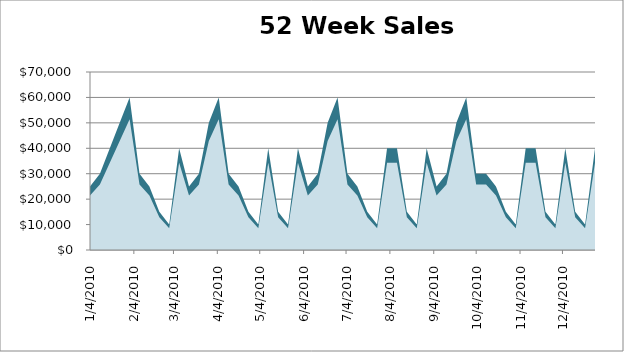
| Category | Widget 1 | Widget 2 | Widget 3 | Widget 4 | Widget 5 | Widget 6 | Widget 7 | Widget 8 | Widget 9 |
|---|---|---|---|---|---|---|---|---|---|
| 1/4/10 | 25000 | 20000 | 14000 | 7000 | 7700 | 13090 | 15353.333 | 18398.333 | 21443.333 |
| 1/11/10 | 30000 | 24000 | 16800 | 8400 | 9240 | 15708 | 18424 | 22078 | 25732 |
| 1/18/10 | 40000 | 32000 | 22400 | 11200 | 12320 | 20944 | 24565.333 | 29437.333 | 34309.333 |
| 1/25/10 | 50000 | 40000 | 28000 | 14000 | 15400 | 26180 | 30706.667 | 36796.667 | 42886.667 |
| 2/1/10 | 60000 | 48000 | 33600 | 16800 | 18480 | 31416 | 36848 | 44156 | 51464 |
| 2/8/10 | 30000 | 24000 | 16800 | 8400 | 9240 | 15708 | 18424 | 22078 | 25732 |
| 2/15/10 | 25000 | 20000 | 14000 | 7000 | 7700 | 13090 | 15353.333 | 18398.333 | 21443.333 |
| 2/22/10 | 15000 | 12000 | 8400 | 4200 | 4620 | 7854 | 9212 | 11039 | 12866 |
| 3/1/10 | 10000 | 8000 | 5600 | 2800 | 3080 | 5236 | 6141.333 | 7359.333 | 8577.333 |
| 3/8/10 | 40000 | 32000 | 22400 | 11200 | 12320 | 20944 | 24565.333 | 29437.333 | 34309.333 |
| 3/15/10 | 25000 | 20000 | 14000 | 7000 | 7700 | 13090 | 15353.333 | 18398.333 | 21443.333 |
| 3/22/10 | 30000 | 24000 | 16800 | 8400 | 9240 | 15708 | 18424 | 22078 | 25732 |
| 3/29/10 | 50000 | 40000 | 28000 | 14000 | 15400 | 26180 | 30706.667 | 36796.667 | 42886.667 |
| 4/5/10 | 60000 | 48000 | 33600 | 16800 | 18480 | 31416 | 36848 | 44156 | 51464 |
| 4/12/10 | 30000 | 24000 | 16800 | 8400 | 9240 | 15708 | 18424 | 22078 | 25732 |
| 4/19/10 | 25000 | 20000 | 14000 | 7000 | 7700 | 13090 | 15353.333 | 18398.333 | 21443.333 |
| 4/26/10 | 15000 | 12000 | 8400 | 4200 | 4620 | 7854 | 9212 | 11039 | 12866 |
| 5/3/10 | 10000 | 8000 | 5600 | 2800 | 3080 | 5236 | 6141.333 | 7359.333 | 8577.333 |
| 5/10/10 | 40000 | 32000 | 22400 | 11200 | 12320 | 20944 | 24565.333 | 29437.333 | 34309.333 |
| 5/17/10 | 15000 | 12000 | 8400 | 4200 | 4620 | 7854 | 9212 | 11039 | 12866 |
| 5/24/10 | 10000 | 8000 | 5600 | 2800 | 3080 | 5236 | 6141.333 | 7359.333 | 8577.333 |
| 5/31/10 | 40000 | 32000 | 22400 | 11200 | 12320 | 20944 | 24565.333 | 29437.333 | 34309.333 |
| 6/7/10 | 25000 | 20000 | 14000 | 7000 | 7700 | 13090 | 15353.333 | 18398.333 | 21443.333 |
| 6/14/10 | 30000 | 24000 | 16800 | 8400 | 9240 | 15708 | 18424 | 22078 | 25732 |
| 6/21/10 | 50000 | 40000 | 28000 | 14000 | 15400 | 26180 | 30706.667 | 36796.667 | 42886.667 |
| 6/28/10 | 60000 | 48000 | 33600 | 16800 | 18480 | 31416 | 36848 | 44156 | 51464 |
| 7/5/10 | 30000 | 24000 | 16800 | 8400 | 9240 | 15708 | 18424 | 22078 | 25732 |
| 7/12/10 | 25000 | 20000 | 14000 | 7000 | 7700 | 13090 | 15353.333 | 18398.333 | 21443.333 |
| 7/19/10 | 15000 | 12000 | 8400 | 4200 | 4620 | 7854 | 9212 | 11039 | 12866 |
| 7/26/10 | 10000 | 8000 | 5600 | 2800 | 3080 | 5236 | 6141.333 | 7359.333 | 8577.333 |
| 8/2/10 | 40000 | 32000 | 22400 | 11200 | 12320 | 20944 | 24565.333 | 29437.333 | 34309.333 |
| 8/9/10 | 40000 | 32000 | 22400 | 11200 | 12320 | 20944 | 24565.333 | 29437.333 | 34309.333 |
| 8/16/10 | 15000 | 12000 | 8400 | 4200 | 4620 | 7854 | 9212 | 11039 | 12866 |
| 8/23/10 | 10000 | 8000 | 5600 | 2800 | 3080 | 5236 | 6141.333 | 7359.333 | 8577.333 |
| 8/30/10 | 40000 | 32000 | 22400 | 11200 | 12320 | 20944 | 24565.333 | 29437.333 | 34309.333 |
| 9/6/10 | 25000 | 20000 | 14000 | 7000 | 7700 | 13090 | 15353.333 | 18398.333 | 21443.333 |
| 9/13/10 | 30000 | 24000 | 16800 | 8400 | 9240 | 15708 | 18424 | 22078 | 25732 |
| 9/20/10 | 50000 | 40000 | 28000 | 14000 | 15400 | 26180 | 30706.667 | 36796.667 | 42886.667 |
| 9/27/10 | 60000 | 48000 | 33600 | 16800 | 18480 | 31416 | 36848 | 44156 | 51464 |
| 10/4/10 | 30000 | 24000 | 16800 | 8400 | 9240 | 15708 | 18424 | 22078 | 25732 |
| 10/11/10 | 30000 | 24000 | 16800 | 8400 | 9240 | 15708 | 18424 | 22078 | 25732 |
| 10/18/10 | 25000 | 20000 | 14000 | 7000 | 7700 | 13090 | 15353.333 | 18398.333 | 21443.333 |
| 10/25/10 | 15000 | 12000 | 8400 | 4200 | 4620 | 7854 | 9212 | 11039 | 12866 |
| 11/1/10 | 10000 | 8000 | 5600 | 2800 | 3080 | 5236 | 6141.333 | 7359.333 | 8577.333 |
| 11/8/10 | 40000 | 32000 | 22400 | 11200 | 12320 | 20944 | 24565.333 | 29437.333 | 34309.333 |
| 11/15/10 | 40000 | 32000 | 22400 | 11200 | 12320 | 20944 | 24565.333 | 29437.333 | 34309.333 |
| 11/22/10 | 15000 | 12000 | 8400 | 4200 | 4620 | 7854 | 9212 | 11039 | 12866 |
| 11/29/10 | 10000 | 8000 | 5600 | 2800 | 3080 | 5236 | 6141.333 | 7359.333 | 8577.333 |
| 12/6/10 | 40000 | 32000 | 22400 | 11200 | 12320 | 20944 | 24565.333 | 29437.333 | 34309.333 |
| 12/13/10 | 15000 | 12000 | 8400 | 4200 | 4620 | 7854 | 9212 | 11039 | 12866 |
| 12/20/10 | 10000 | 8000 | 5600 | 2800 | 3080 | 5236 | 6141.333 | 7359.333 | 8577.333 |
| 12/27/10 | 40000 | 32000 | 22400 | 11200 | 12320 | 20944 | 24565.333 | 29437.333 | 34309.333 |